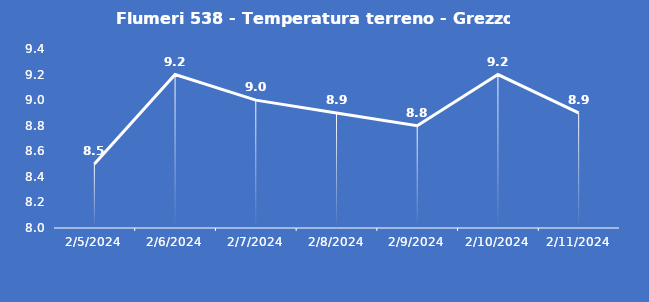
| Category | Flumeri 538 - Temperatura terreno - Grezzo (°C) |
|---|---|
| 2/5/24 | 8.5 |
| 2/6/24 | 9.2 |
| 2/7/24 | 9 |
| 2/8/24 | 8.9 |
| 2/9/24 | 8.8 |
| 2/10/24 | 9.2 |
| 2/11/24 | 8.9 |